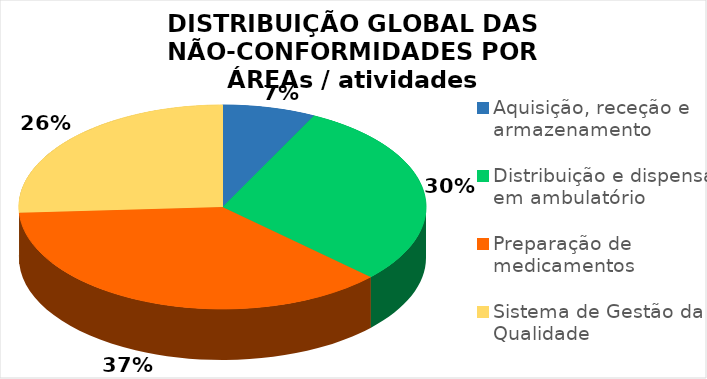
| Category | Total por área |
|---|---|
| Aquisição, receção e armazenamento | 2 |
| Distribuição e dispensa em ambulatório | 8 |
| Preparação de medicamentos | 10 |
| Sistema de Gestão da Qualidade | 7 |